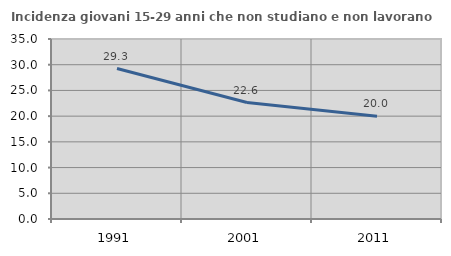
| Category | Incidenza giovani 15-29 anni che non studiano e non lavorano  |
|---|---|
| 1991.0 | 29.256 |
| 2001.0 | 22.642 |
| 2011.0 | 20 |